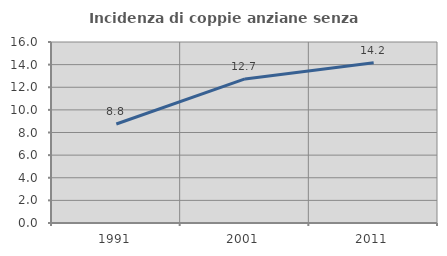
| Category | Incidenza di coppie anziane senza figli  |
|---|---|
| 1991.0 | 8.753 |
| 2001.0 | 12.738 |
| 2011.0 | 14.156 |